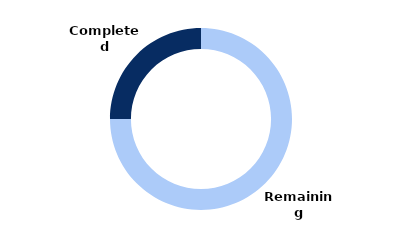
| Category | Series 0 |
|---|---|
| Completed | 0.25 |
| Remaining | 0.75 |